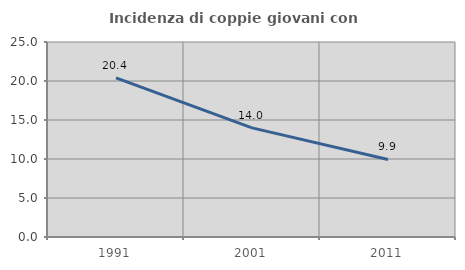
| Category | Incidenza di coppie giovani con figli |
|---|---|
| 1991.0 | 20.396 |
| 2001.0 | 13.99 |
| 2011.0 | 9.944 |